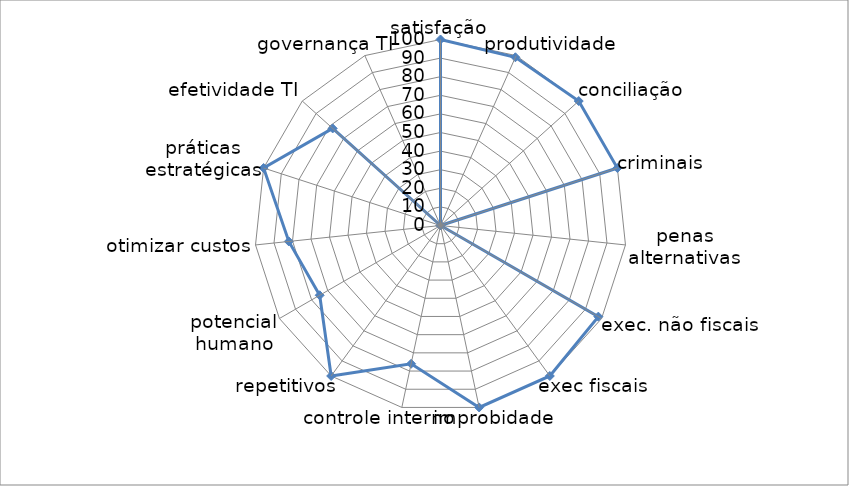
| Category | Series 0 |
|---|---|
| 0 | 100 |
| 1 | 99 |
| 2 | 100 |
| 3 | 100 |
| 4 | 0 |
| 5 | 98 |
| 6 | 100 |
| 7 | 100 |
| 8 | 76 |
| 9 | 100 |
| 10 | 75 |
| 11 | 82 |
| 12 | 100 |
| 13 | 78 |
| 14 | 0 |